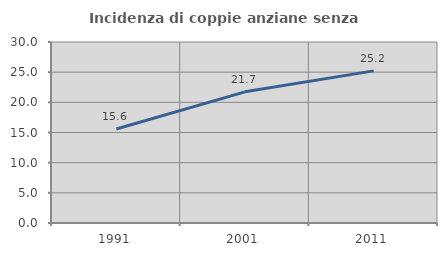
| Category | Incidenza di coppie anziane senza figli  |
|---|---|
| 1991.0 | 15.581 |
| 2001.0 | 21.739 |
| 2011.0 | 25.215 |